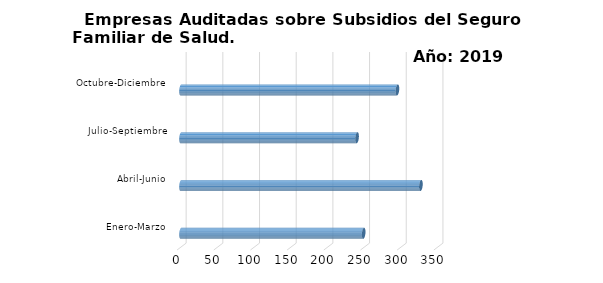
| Category | Empresas Auditadas | Series 1 | Series 2 |
|---|---|---|---|
| Enero-Marzo | 249 |  |  |
| Abril-Junio | 327 |  |  |
| Julio-Septiembre | 240 |  |  |
| Octubre-Diciembre | 295 |  |  |